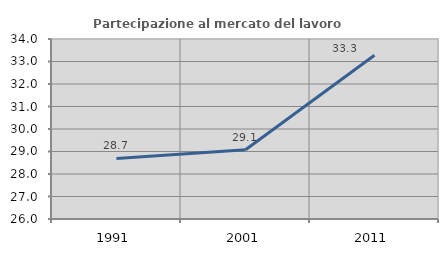
| Category | Partecipazione al mercato del lavoro  femminile |
|---|---|
| 1991.0 | 28.69 |
| 2001.0 | 29.079 |
| 2011.0 | 33.277 |